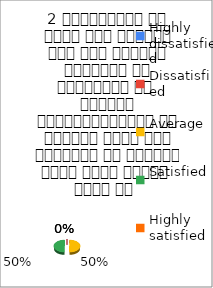
| Category | 2 व्याख्यान से रूचि में वृद्धि हुई एवं शिक्षण जानकारी से परिपूर्ण था 
शिक्षक विद्यार्थियों के द्वारा पूछे गये प्रश्नो का समाधान करने हेतु तत्पर  रहते है  |
|---|---|
| Highly dissatisfied | 0 |
| Dissatisfied | 0 |
| Average | 1 |
| Satisfied | 1 |
| Highly satisfied | 0 |